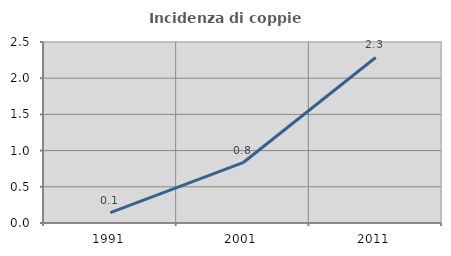
| Category | Incidenza di coppie miste |
|---|---|
| 1991.0 | 0.142 |
| 2001.0 | 0.833 |
| 2011.0 | 2.286 |